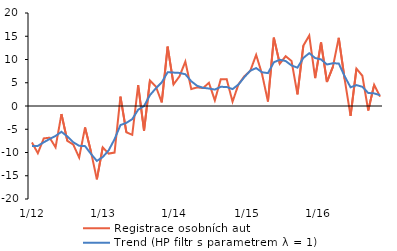
| Category | Registrace osobních aut | Trend (HP filtr s parametrem λ = 1) |
|---|---|---|
|  1/12 | -7.839 | -8.595 |
| 2 | -10.154 | -8.576 |
| 3 | -6.965 | -7.803 |
| 4 | -6.817 | -7.097 |
| 5 | -8.886 | -6.443 |
| 6 | -1.732 | -5.545 |
| 7 | -7.505 | -6.551 |
| 8 | -8.281 | -7.793 |
| 9 | -11.078 | -8.561 |
| 10 | -4.603 | -8.629 |
| 11 | -9.813 | -10.291 |
| 12 | -15.77 | -11.811 |
|  1/13 | -8.873 | -10.979 |
| 2 | -10.228 | -9.541 |
| 3 | -10.015 | -7.139 |
| 4 | 2.002 | -4.101 |
| 5 | -5.636 | -3.63 |
| 6 | -6.194 | -2.827 |
| 7 | 4.491 | -0.798 |
| 8 | -5.286 | -0.015 |
| 9 | 5.492 | 2.336 |
| 10 | 4.193 | 3.8 |
| 11 | 0.797 | 5.081 |
| 12 | 12.76 | 7.272 |
|  1/14 | 4.644 | 7.184 |
| 2 | 6.365 | 7.115 |
| 3 | 9.543 | 6.825 |
| 4 | 3.641 | 5.323 |
| 5 | 4.003 | 4.338 |
| 6 | 3.858 | 3.913 |
| 7 | 4.995 | 3.76 |
| 8 | 1.207 | 3.533 |
| 9 | 5.747 | 4.124 |
| 10 | 5.779 | 4.095 |
| 11 | 0.931 | 3.636 |
| 12 | 4.643 | 4.616 |
|   1/15 | 6.395 | 6.202 |
| 2 | 7.546 | 7.586 |
| 3 | 10.996 | 8.154 |
| 4 | 6.863 | 7.253 |
| 5 | 0.966 | 7.07 |
| 6 | 14.69 | 9.402 |
| 7 | 9.093 | 9.943 |
| 8 | 10.697 | 9.672 |
| 9 | 9.662 | 8.721 |
| 10 | 2.511 | 8.244 |
| 11 | 12.976 | 10.336 |
| 12 | 15.16 | 11.361 |
|   1/16 | 6.005 | 10.32 |
| 2 | 13.653 | 10.014 |
| 3 | 5.164 | 8.928 |
| 4 | 8.407 | 9.186 |
| 5 | 14.662 | 9.148 |
| 6 | 5.763 | 6.395 |
| 7 | -2.116 | 4.022 |
| 8 | 8.018 | 4.493 |
| 9 | 6.506 | 4.135 |
| 10 | -0.965 | 2.8 |
| 11 | 4.551 | 2.711 |
| 12 | 2.029 | 2.326 |